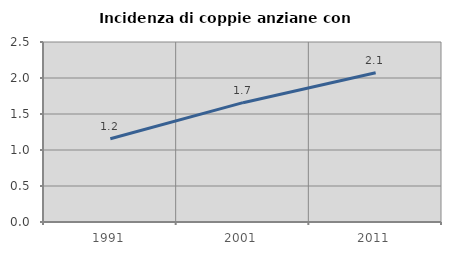
| Category | Incidenza di coppie anziane con figli |
|---|---|
| 1991.0 | 1.156 |
| 2001.0 | 1.657 |
| 2011.0 | 2.073 |